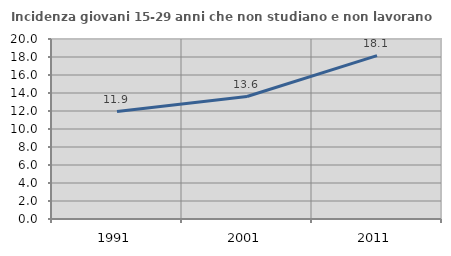
| Category | Incidenza giovani 15-29 anni che non studiano e non lavorano  |
|---|---|
| 1991.0 | 11.937 |
| 2001.0 | 13.605 |
| 2011.0 | 18.147 |